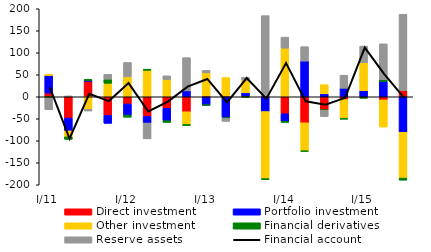
| Category | Direct investment | Portfolio investment | Other investment | Financial derivatives | Reserve assets |
|---|---|---|---|---|---|
| I/11 | 8.394 | 39.909 | 2.964 | -2.567 | -26.789 |
| II | -48.128 | -29.388 | -13.604 | -5.635 | 2.123 |
| III | 35.202 | 1.853 | -28.649 | 2.491 | -3.698 |
| IV | -42.273 | -18.154 | 30.668 | 9.385 | 11.134 |
| I/12 | -16.29 | -25.293 | 45.36 | -4.87 | 32.632 |
| II | -44.641 | -14.957 | 60.168 | 2.453 | -35.982 |
| III | -26.334 | -28.062 | 39.368 | -3.806 | 8.321 |
| IV | -33.997 | 13.465 | -28.955 | -2.395 | 75.502 |
| I/13 | 1.859 | -18.95 | 52.574 | -0.086 | 5.61 |
| II | 1.859 | -47.44 | 41.851 | -1.44 | -6.912 |
| III | 1.859 | 7.148 | 28.263 | -1.061 | 6.889 |
| IV | 1.859 | -33.596 | -152.434 | -2.15 | 182.604 |
| I/14 | -38.685 | -16.995 | 110.469 | -2.764 | 25.08 |
| II | -59.028 | 81.147 | -64.302 | -0.503 | 32.776 |
| III | -29.662 | 6.715 | 20.861 | -0.818 | -14.448 |
| IV | -6.258 | 19.403 | -42.777 | -1.962 | 29.714 |
| I/15 | -2.497 | 13.794 | 63.476 | -0.585 | 38.01 |
| II | -7.16 | 34.761 | -61.587 | 4.391 | 81.243 |
| III | 14.024 | -80.702 | -104.13 | -4.594 | 173.44 |